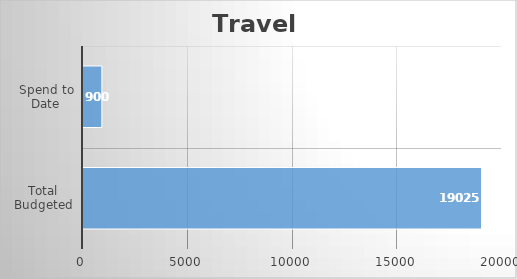
| Category | Travel  |
|---|---|
| Total Budgeted | 19025 |
| Spend to Date | 900 |